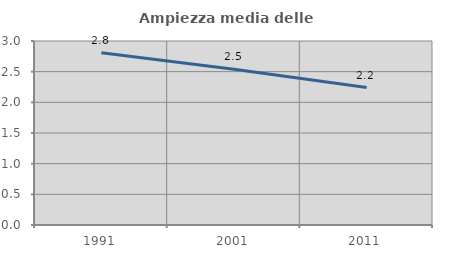
| Category | Ampiezza media delle famiglie |
|---|---|
| 1991.0 | 2.808 |
| 2001.0 | 2.539 |
| 2011.0 | 2.241 |